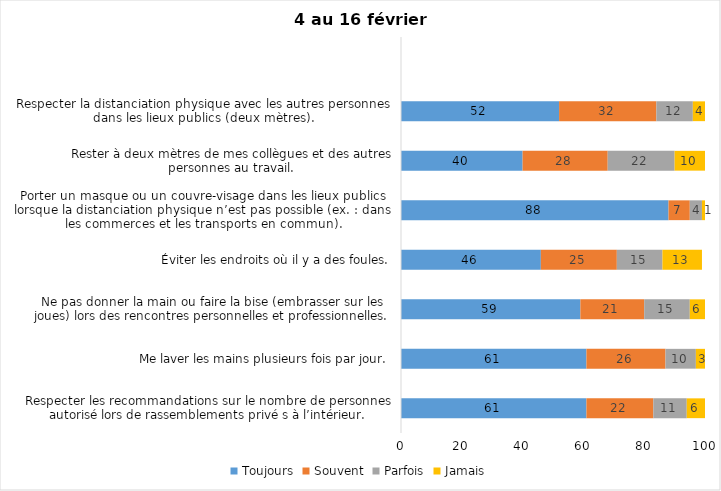
| Category | Toujours | Souvent | Parfois | Jamais |
|---|---|---|---|---|
| Respecter les recommandations sur le nombre de personnes autorisé lors de rassemblements privé s à l’intérieur. | 61 | 22 | 11 | 6 |
| Me laver les mains plusieurs fois par jour. | 61 | 26 | 10 | 3 |
| Ne pas donner la main ou faire la bise (embrasser sur les joues) lors des rencontres personnelles et professionnelles. | 59 | 21 | 15 | 6 |
| Éviter les endroits où il y a des foules. | 46 | 25 | 15 | 13 |
| Porter un masque ou un couvre-visage dans les lieux publics lorsque la distanciation physique n’est pas possible (ex. : dans les commerces et les transports en commun). | 88 | 7 | 4 | 1 |
| Rester à deux mètres de mes collègues et des autres personnes au travail. | 40 | 28 | 22 | 10 |
| Respecter la distanciation physique avec les autres personnes dans les lieux publics (deux mètres). | 52 | 32 | 12 | 4 |